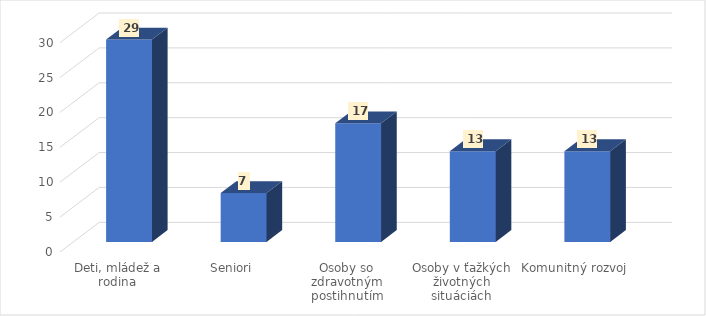
| Category | Počet zrealizovaných aktivít |
|---|---|
| Deti, mládež a rodina | 29 |
| Seniori | 7 |
| Osoby so zdravotným postihnutím | 17 |
| Osoby v ťažkých životných situáciách | 13 |
| Komunitný rozvoj | 13 |